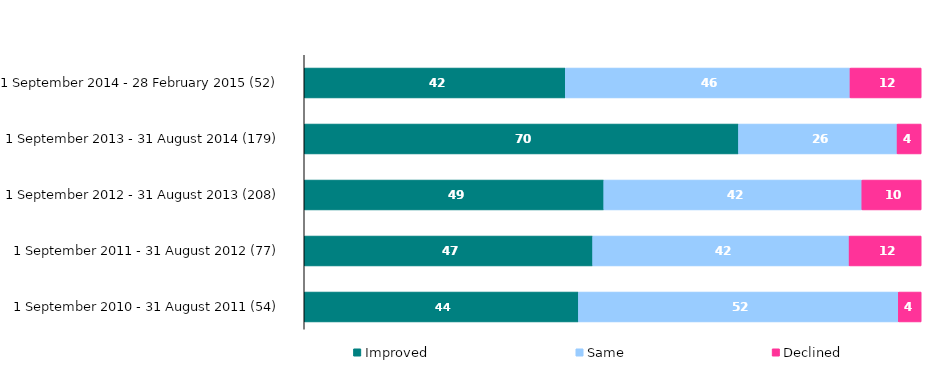
| Category | Improved | Same | Declined |
|---|---|---|---|
| 1 September 2014 - 28 February 2015 (52) | 42.308 | 46.154 | 11.538 |
| 1 September 2013 - 31 August 2014 (179) | 70.391 | 25.698 | 3.911 |
| 1 September 2012 - 31 August 2013 (208) | 48.558 | 41.827 | 9.615 |
| 1 September 2011 - 31 August 2012 (77) | 46.753 | 41.558 | 11.688 |
| 1 September 2010 - 31 August 2011 (54) | 44.444 | 51.852 | 3.704 |